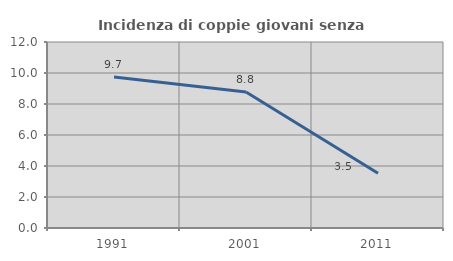
| Category | Incidenza di coppie giovani senza figli |
|---|---|
| 1991.0 | 9.735 |
| 2001.0 | 8.778 |
| 2011.0 | 3.529 |